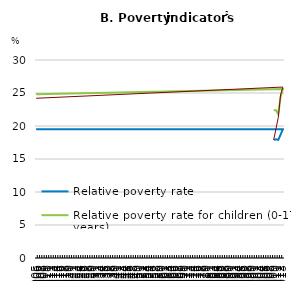
| Category | Relative poverty rate | Relative poverty rate for children (0-17 years) | Anchored poverty line |
|---|---|---|---|
| 2009-01-01 | 17.9 | 22.4 | 17.9 |
| 2010-01-01 | 18 | 22.4 | 19.6 |
| 2011-01-01 | 17.9 | 21.8 | 21.3 |
| 2012-01-01 | 18.7 | 24.4 | 24.7 |
| 2013-01-01 | 19.5 | 25.6 | 25.9 |
| 1905-07-06 | 19.5 | 24.8 | 24.2 |